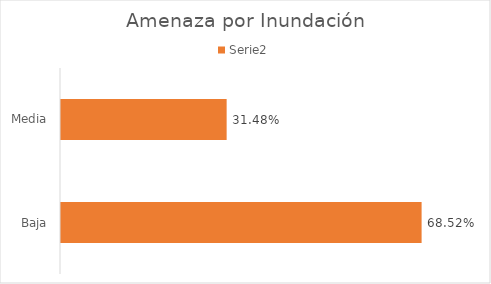
| Category | Serie2 |
|---|---|
| Baja | 0.685 |
| Media | 0.315 |